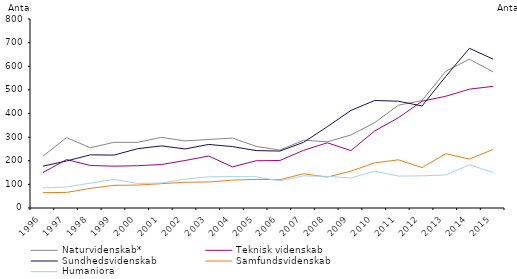
| Category | Naturvidenskab* | Teknisk videnskab | Sundhedsvidenskab | Samfundsvidenskab | Humaniora |
|---|---|---|---|---|---|
| 1996.0 | 219 | 150 | 177 | 65 | 85 |
| 1997.0 | 298 | 205 | 199 | 66 | 89 |
| 1998.0 | 255 | 180 | 225 | 83 | 105 |
| 1999.0 | 278 | 177 | 224 | 96 | 121 |
| 2000.0 | 278 | 179 | 251 | 97 | 104 |
| 2001.0 | 299 | 184 | 263 | 103 | 106 |
| 2002.0 | 284 | 201 | 250 | 109 | 122 |
| 2003.0 | 290 | 220 | 269 | 110 | 132 |
| 2004.0 | 296 | 174 | 260 | 118 | 133 |
| 2005.0 | 261 | 200 | 243 | 121 | 132 |
| 2006.0 | 245 | 201 | 241 | 120 | 115 |
| 2007.0 | 287 | 244 | 278 | 145 | 136 |
| 2008.0 | 280 | 276 | 344 | 131 | 134 |
| 2009.0 | 309 | 243 | 413 | 156 | 127 |
| 2010.0 | 361 | 326 | 455 | 191 | 156 |
| 2011.0 | 435 | 382 | 452 | 204 | 135 |
| 2012.0 | 455 | 452 | 432 | 171 | 136 |
| 2013.0 | 579 | 473 | 557 | 230 | 140 |
| 2014.0 | 630 | 503 | 676 | 207 | 183 |
| 2015.0 | 576 | 515 | 630 | 248 | 150 |